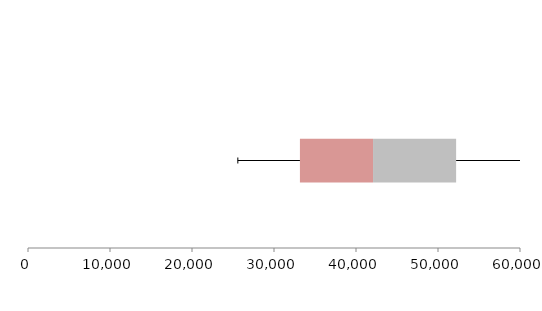
| Category | Series 1 | Series 2 | Series 3 |
|---|---|---|---|
| 0 | 33162.414 | 8915.584 | 10132.584 |